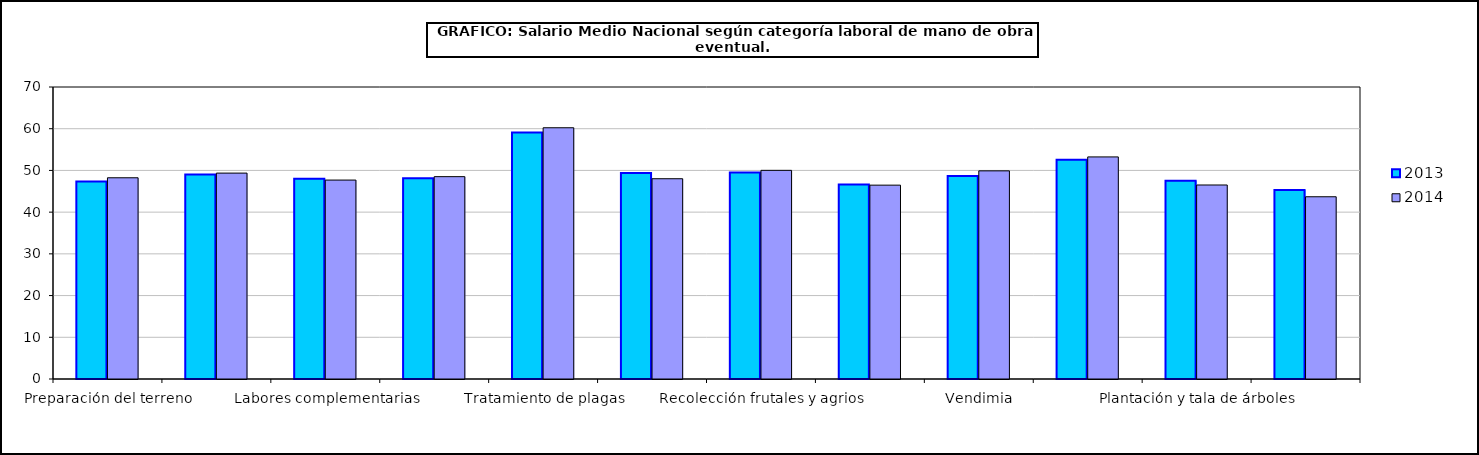
| Category | 2013 | 2014 |
|---|---|---|
|  Preparación del terreno | 47.33 | 48.24 |
|  Siembra y abonado | 49 | 49.36 |
|  Labores complementarias | 47.98 | 47.69 |
|  Riegos | 48.11 | 48.51 |
|  Tratamiento de plagas | 59.08 | 60.23 |
|  Recolección productos herbáceos | 49.36 | 48.01 |
|  Recolección frutales y agrios | 49.51 | 50.02 |
|  Recolección de aceituna | 46.6 | 46.47 |
|  Vendimia | 48.67 | 49.9 |
|  Poda | 52.57 | 53.24 |
|  Plantación y tala de árboles | 47.51 | 46.51 |
|  Manejo de ganado | 45.32 | 43.69 |